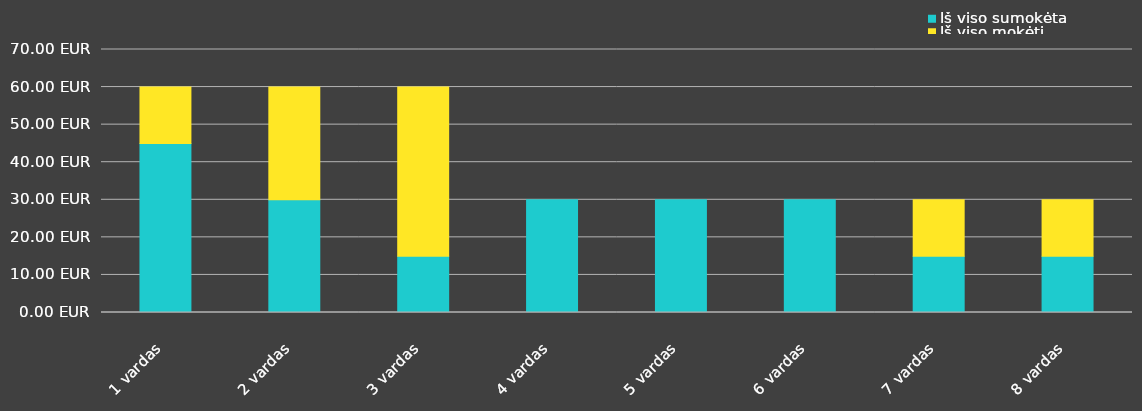
| Category | Iš viso sumokėta | Iš viso mokėti |
|---|---|---|
| 1 vardas | 45 | 15 |
| 2 vardas | 30 | 30 |
| 3 vardas | 15 | 45 |
| 4 vardas | 30 | 0 |
| 5 vardas | 30 | 0 |
| 6 vardas | 30 | 0 |
| 7 vardas | 15 | 15 |
| 8 vardas | 15 | 15 |